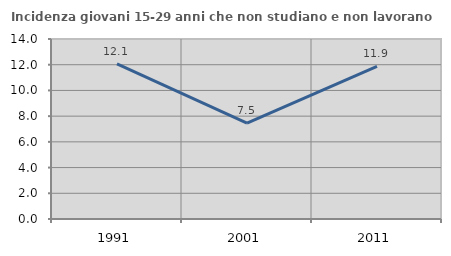
| Category | Incidenza giovani 15-29 anni che non studiano e non lavorano  |
|---|---|
| 1991.0 | 12.063 |
| 2001.0 | 7.46 |
| 2011.0 | 11.875 |